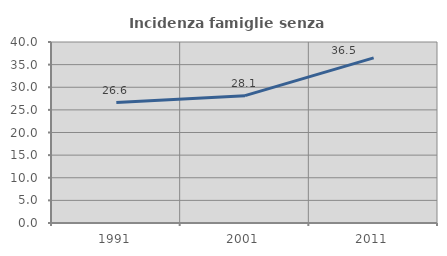
| Category | Incidenza famiglie senza nuclei |
|---|---|
| 1991.0 | 26.613 |
| 2001.0 | 28.148 |
| 2011.0 | 36.486 |